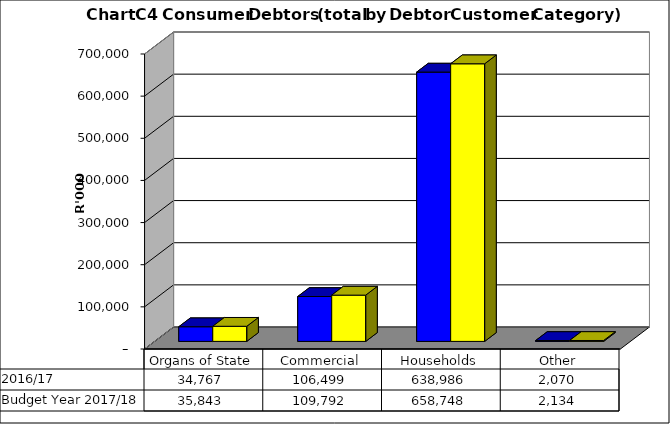
| Category |  2016/17  | Budget Year 2017/18 |
|---|---|---|
| Organs of State | 34767352.167 | 35842631.1 |
| Commercial | 106498636.555 | 109792408.82 |
| Households | 638985877.869 | 658748327.7 |
| Other | 2069690.921 | 2133701.98 |